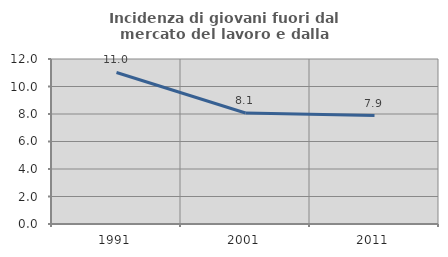
| Category | Incidenza di giovani fuori dal mercato del lavoro e dalla formazione  |
|---|---|
| 1991.0 | 11.022 |
| 2001.0 | 8.07 |
| 2011.0 | 7.886 |